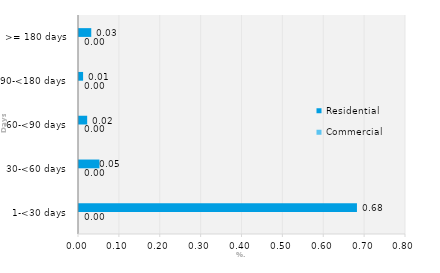
| Category | Commercial | Residential |
|---|---|---|
| 1-<30 days | 0 | 0.68 |
| 30-<60 days | 0 | 0.05 |
| 60-<90 days | 0 | 0.02 |
| 90-<180 days | 0 | 0.01 |
| >= 180 days | 0 | 0.03 |